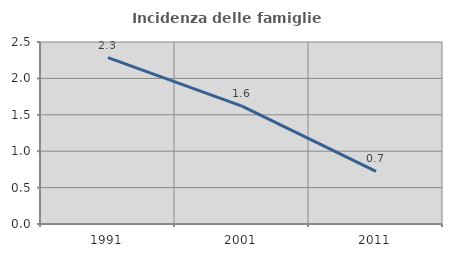
| Category | Incidenza delle famiglie numerose |
|---|---|
| 1991.0 | 2.286 |
| 2001.0 | 1.619 |
| 2011.0 | 0.723 |